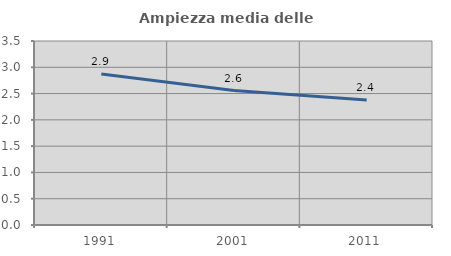
| Category | Ampiezza media delle famiglie |
|---|---|
| 1991.0 | 2.87 |
| 2001.0 | 2.558 |
| 2011.0 | 2.376 |